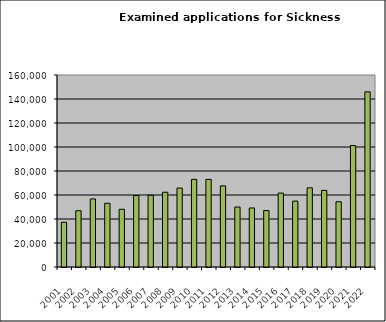
| Category | Series 0 |
|---|---|
| 2001.0 | 37288 |
| 2002.0 | 46864 |
| 2003.0 | 56711 |
| 2004.0 | 53104 |
| 2005.0 | 48134 |
| 2006.0 | 59570 |
| 2007.0 | 59808 |
| 2008.0 | 62281 |
| 2009.0 | 65772 |
| 2010.0 | 73024 |
| 2011.0 | 73024 |
| 2012.0 | 67592 |
| 2013.0 | 49956 |
| 2014.0 | 49186 |
| 2015.0 | 47030 |
| 2016.0 | 61595 |
| 2017.0 | 54899 |
| 2018.0 | 65950 |
| 2019.0 | 63827 |
| 2020.0 | 54371 |
| 2021.0 | 101230 |
| 2022.0 | 145940 |